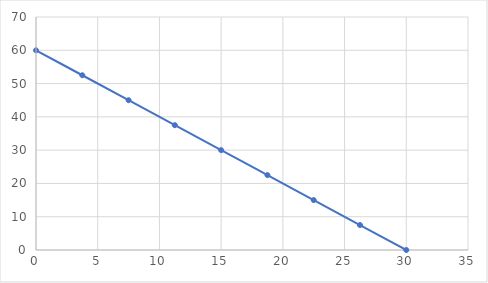
| Category | cereja |
|---|---|
| 30.0 | 0 |
| 26.25 | 7.5 |
| 22.5 | 15 |
| 18.75 | 22.5 |
| 15.0 | 30 |
| 11.25 | 37.5 |
| 7.5 | 45 |
| 3.75 | 52.5 |
| 0.0 | 60 |